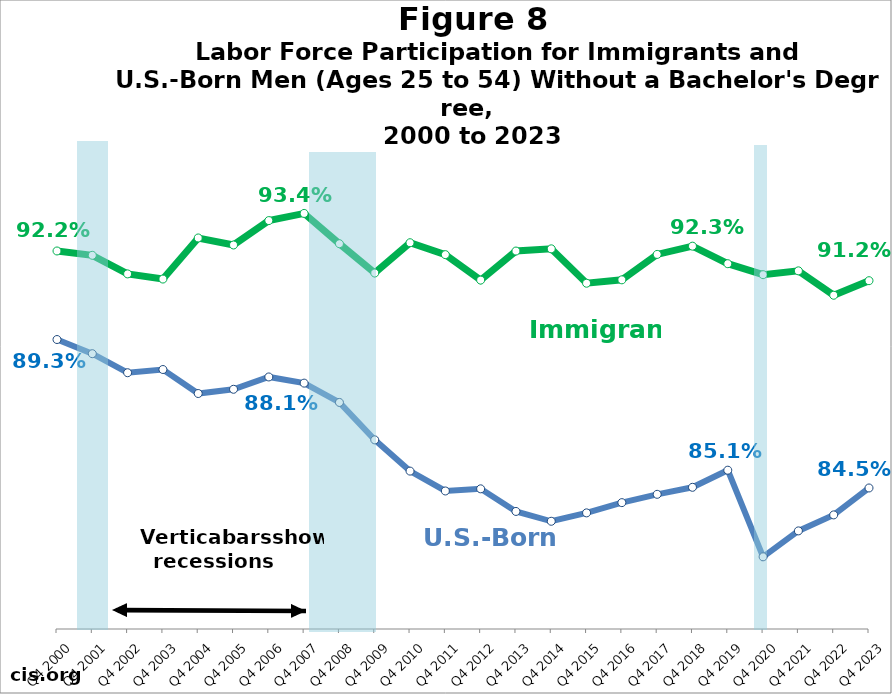
| Category | Native | Immigrant |
|---|---|---|
| Q4 2000 | 0.893 | 0.922 |
| Q4 2001 | 0.889 | 0.92 |
| Q4 2002 | 0.883 | 0.914 |
| Q4 2003 | 0.884 | 0.913 |
| Q4 2004 | 0.876 | 0.926 |
| Q4 2005 | 0.877 | 0.924 |
| Q4 2006 | 0.881 | 0.931 |
| Q4 2007 | 0.879 | 0.934 |
| Q4 2008 | 0.873 | 0.924 |
| Q4 2009 | 0.861 | 0.915 |
| Q4 2010 | 0.851 | 0.924 |
| Q4 2011 | 0.844 | 0.921 |
| Q4 2012 | 0.845 | 0.912 |
| Q4 2013 | 0.838 | 0.922 |
| Q4 2014 | 0.835 | 0.922 |
| Q4 2015 | 0.837 | 0.911 |
| Q4 2016 | 0.841 | 0.912 |
| Q4 2017 | 0.843 | 0.921 |
| Q4 2018 | 0.846 | 0.923 |
| Q4 2019 | 0.851 | 0.918 |
| Q4 2020 | 0.823 | 0.914 |
| Q4 2021 | 0.832 | 0.915 |
| Q4 2022 | 0.837 | 0.907 |
| Q4 2023 | 0.845 | 0.912 |